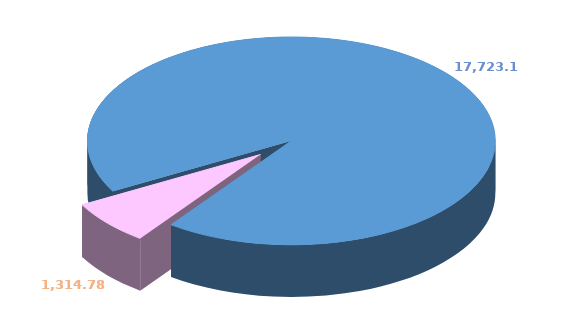
| Category | Series 0 |
|---|---|
| 0 | 17723.118 |
| 1 | 1314.776 |